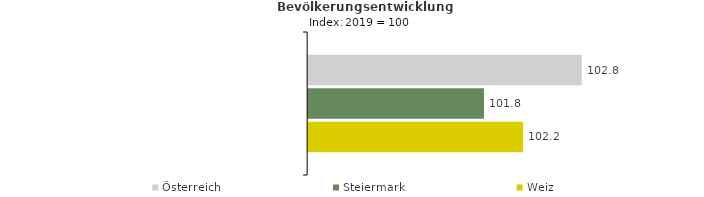
| Category | Österreich | Steiermark | Weiz |
|---|---|---|---|
| 2023.0 | 102.8 | 101.8 | 102.2 |